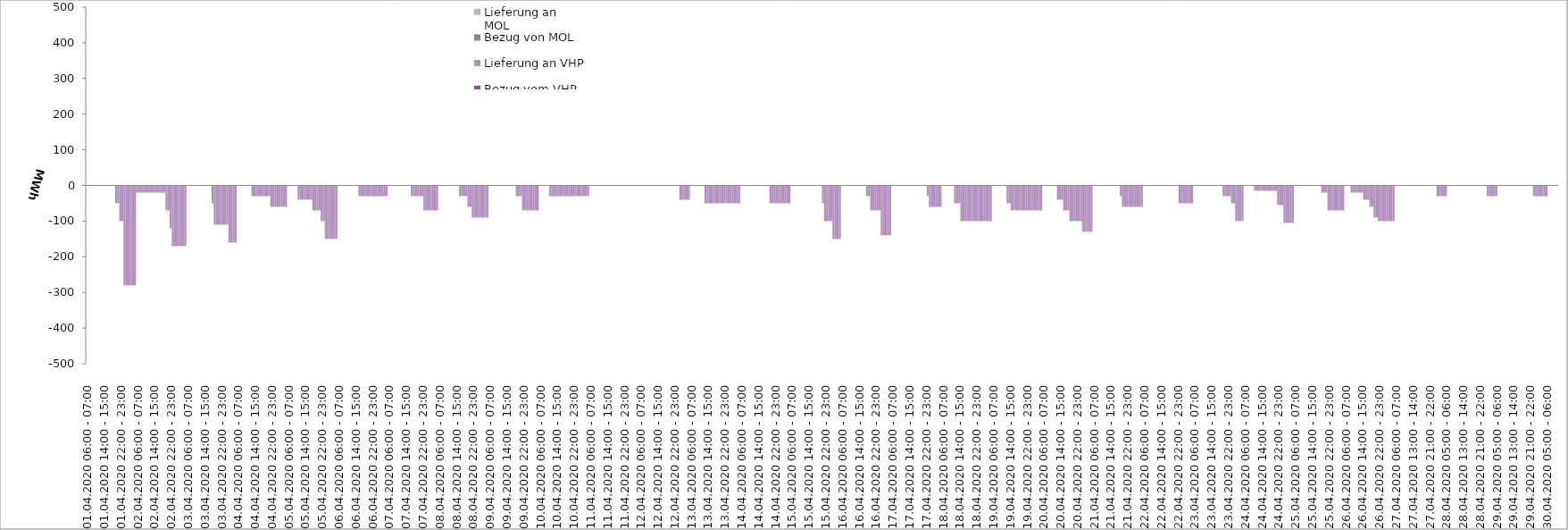
| Category | Bezug vom VHP | Lieferung an VHP | Bezug von MOL | Lieferung an MOL |
|---|---|---|---|---|
| 01.04.2020 06:00 - 07:00 | 0 | 0 | 0 | 0 |
| 01.04.2020 07:00 - 08:00 | 0 | 0 | 0 | 0 |
| 01.04.2020 08:00 - 09:00 | 0 | 0 | 0 | 0 |
| 01.04.2020 09:00 - 10:00 | 0 | 0 | 0 | 0 |
| 01.04.2020 10:00 - 11:00 | 0 | 0 | 0 | 0 |
| 01.04.2020 11:00 - 12:00 | 0 | 0 | 0 | 0 |
| 01.04.2020 12:00 - 13:00 | 0 | 0 | 0 | 0 |
| 01.04.2020 13:00 - 14:00 | 0 | 0 | 0 | 0 |
| 01.04.2020 14:00 - 15:00 | 0 | 0 | 0 | 0 |
| 01.04.2020 15:00 - 16:00 | 0 | 0 | 0 | 0 |
| 01.04.2020 16:00 - 17:00 | 0 | 0 | 0 | 0 |
| 01.04.2020 17:00 - 18:00 | 0 | 0 | 0 | 0 |
| 01.04.2020 18:00 - 19:00 | 0 | 0 | 0 | 0 |
| 01.04.2020 19:00 - 20:00 | 0 | 0 | 0 | 0 |
| 01.04.2020 20:00 - 21:00 | 0 | -50 | 0 | 0 |
| 01.04.2020 21:00 - 22:00 | 0 | -50 | 0 | 0 |
| 01.04.2020 22:00 - 23:00 | 0 | -100 | 0 | 0 |
| 01.04.2020 23:00 - 24:00 | 0 | -100 | 0 | 0 |
| 02.04.2020 00:00 - 01:00 | 0 | -280 | 0 | 0 |
| 02.04.2020 01:00 - 02:00 | 0 | -280 | 0 | 0 |
| 02.04.2020 02:00 - 03:00 | 0 | -280 | 0 | 0 |
| 02.04.2020 03:00 - 04:00 | 0 | -280 | 0 | 0 |
| 02.04.2020 04:00 - 05:00 | 0 | -280 | 0 | 0 |
| 02.04.2020 05:00 - 06:00 | 0 | -280 | 0 | 0 |
| 02.04.2020 06:00 - 07:00 | 0 | -20 | 0 | 0 |
| 02.04.2020 07:00 - 08:00 | 0 | -20 | 0 | 0 |
| 02.04.2020 08:00 - 09:00 | 0 | -20 | 0 | 0 |
| 02.04.2020 09:00 - 10:00 | 0 | -20 | 0 | 0 |
| 02.04.2020 10:00 - 11:00 | 0 | -20 | 0 | 0 |
| 02.04.2020 11:00 - 12:00 | 0 | -20 | 0 | 0 |
| 02.04.2020 12:00 - 13:00 | 0 | -20 | 0 | 0 |
| 02.04.2020 13:00 - 14:00 | 0 | -20 | 0 | 0 |
| 02.04.2020 14:00 - 15:00 | 0 | -20 | 0 | 0 |
| 02.04.2020 15:00 - 16:00 | 0 | -20 | 0 | 0 |
| 02.04.2020 16:00 - 17:00 | 0 | -20 | 0 | 0 |
| 02.04.2020 17:00 - 18:00 | 0 | -20 | 0 | 0 |
| 02.04.2020 18:00 - 19:00 | 0 | -20 | 0 | 0 |
| 02.04.2020 19:00 - 20:00 | 0 | -20 | 0 | 0 |
| 02.04.2020 20:00 - 21:00 | 0 | -70 | 0 | 0 |
| 02.04.2020 21:00 - 22:00 | 0 | -70 | 0 | 0 |
| 02.04.2020 22:00 - 23:00 | 0 | -120 | 0 | 0 |
| 02.04.2020 23:00 - 24:00 | 0 | -170 | 0 | 0 |
| 03.04.2020 00:00 - 01:00 | 0 | -170 | 0 | 0 |
| 03.04.2020 01:00 - 02:00 | 0 | -170 | 0 | 0 |
| 03.04.2020 02:00 - 03:00 | 0 | -170 | 0 | 0 |
| 03.04.2020 03:00 - 04:00 | 0 | -170 | 0 | 0 |
| 03.04.2020 04:00 - 05:00 | 0 | -170 | 0 | 0 |
| 03.04.2020 05:00 - 06:00 | 0 | -170 | 0 | 0 |
| 03.04.2020 06:00 - 07:00 | 0 | 0 | 0 | 0 |
| 03.04.2020 07:00 - 08:00 | 0 | 0 | 0 | 0 |
| 03.04.2020 08:00 - 09:00 | 0 | 0 | 0 | 0 |
| 03.04.2020 09:00 - 10:00 | 0 | 0 | 0 | 0 |
| 03.04.2020 10:00 - 11:00 | 0 | 0 | 0 | 0 |
| 03.04.2020 11:00 - 12:00 | 0 | 0 | 0 | 0 |
| 03.04.2020 12:00 - 13:00 | 0 | 0 | 0 | 0 |
| 03.04.2020 13:00 - 14:00 | 0 | 0 | 0 | 0 |
| 03.04.2020 14:00 - 15:00 | 0 | 0 | 0 | 0 |
| 03.04.2020 15:00 - 16:00 | 0 | 0 | 0 | 0 |
| 03.04.2020 16:00 - 17:00 | 0 | 0 | 0 | 0 |
| 03.04.2020 17:00 - 18:00 | 0 | 0 | 0 | 0 |
| 03.04.2020 18:00 - 19:00 | 0 | -50 | 0 | 0 |
| 03.04.2020 19:00 - 20:00 | 0 | -110 | 0 | 0 |
| 03.04.2020 20:00 - 21:00 | 0 | -110 | 0 | 0 |
| 03.04.2020 21:00 - 22:00 | 0 | -110 | 0 | 0 |
| 03.04.2020 22:00 - 23:00 | 0 | -110 | 0 | 0 |
| 03.04.2020 23:00 - 24:00 | 0 | -110 | 0 | 0 |
| 04.04.2020 00:00 - 01:00 | 0 | -110 | 0 | 0 |
| 04.04.2020 01:00 - 02:00 | 0 | -110 | 0 | 0 |
| 04.04.2020 02:00 - 03:00 | 0 | -160 | 0 | 0 |
| 04.04.2020 03:00 - 04:00 | 0 | -160 | 0 | 0 |
| 04.04.2020 04:00 - 05:00 | 0 | -160 | 0 | 0 |
| 04.04.2020 05:00 - 06:00 | 0 | -160 | 0 | 0 |
| 04.04.2020 06:00 - 07:00 | 0 | 0 | 0 | 0 |
| 04.04.2020 07:00 - 08:00 | 0 | 0 | 0 | 0 |
| 04.04.2020 08:00 - 09:00 | 0 | 0 | 0 | 0 |
| 04.04.2020 09:00 - 10:00 | 0 | 0 | 0 | 0 |
| 04.04.2020 10:00 - 11:00 | 0 | 0 | 0 | 0 |
| 04.04.2020 11:00 - 12:00 | 0 | 0 | 0 | 0 |
| 04.04.2020 12:00 - 13:00 | 0 | 0 | 0 | 0 |
| 04.04.2020 13:00 - 14:00 | 0 | -30 | 0 | 0 |
| 04.04.2020 14:00 - 15:00 | 0 | -30 | 0 | 0 |
| 04.04.2020 15:00 - 16:00 | 0 | -30 | 0 | 0 |
| 04.04.2020 16:00 - 17:00 | 0 | -30 | 0 | 0 |
| 04.04.2020 17:00 - 18:00 | 0 | -30 | 0 | 0 |
| 04.04.2020 18:00 - 19:00 | 0 | -30 | 0 | 0 |
| 04.04.2020 19:00 - 20:00 | 0 | -30 | 0 | 0 |
| 04.04.2020 20:00 - 21:00 | 0 | -30 | 0 | 0 |
| 04.04.2020 21:00 - 22:00 | 0 | -30 | 0 | 0 |
| 04.04.2020 22:00 - 23:00 | 0 | -60 | 0 | 0 |
| 04.04.2020 23:00 - 24:00 | 0 | -60 | 0 | 0 |
| 05.04.2020 00:00 - 01:00 | 0 | -60 | 0 | 0 |
| 05.04.2020 01:00 - 02:00 | 0 | -60 | 0 | 0 |
| 05.04.2020 02:00 - 03:00 | 0 | -60 | 0 | 0 |
| 05.04.2020 03:00 - 04:00 | 0 | -60 | 0 | 0 |
| 05.04.2020 04:00 - 05:00 | 0 | -60 | 0 | 0 |
| 05.04.2020 05:00 - 06:00 | 0 | -60 | 0 | 0 |
| 05.04.2020 06:00 - 07:00 | 0 | 0 | 0 | 0 |
| 05.04.2020 07:00 - 08:00 | 0 | 0 | 0 | 0 |
| 05.04.2020 08:00 - 09:00 | 0 | 0 | 0 | 0 |
| 05.04.2020 09:00 - 10:00 | 0 | 0 | 0 | 0 |
| 05.04.2020 10:00 - 11:00 | 0 | 0 | 0 | 0 |
| 05.04.2020 11:00 - 12:00 | 0 | -40 | 0 | 0 |
| 05.04.2020 12:00 - 13:00 | 0 | -40 | 0 | 0 |
| 05.04.2020 13:00 - 14:00 | 0 | -40 | 0 | 0 |
| 05.04.2020 14:00 - 15:00 | 0 | -40 | 0 | 0 |
| 05.04.2020 15:00 - 16:00 | 0 | -40 | 0 | 0 |
| 05.04.2020 16:00 - 17:00 | 0 | -40 | 0 | 0 |
| 05.04.2020 17:00 - 18:00 | 0 | -40 | 0 | 0 |
| 05.04.2020 18:00 - 19:00 | 0 | -70 | 0 | 0 |
| 05.04.2020 19:00 - 20:00 | 0 | -70 | 0 | 0 |
| 05.04.2020 20:00 - 21:00 | 0 | -70 | 0 | 0 |
| 05.04.2020 21:00 - 22:00 | 0 | -70 | 0 | 0 |
| 05.04.2020 22:00 - 23:00 | 0 | -100 | 0 | 0 |
| 05.04.2020 23:00 - 24:00 | 0 | -100 | 0 | 0 |
| 06.04.2020 00:00 - 01:00 | 0 | -150 | 0 | 0 |
| 06.04.2020 01:00 - 02:00 | 0 | -150 | 0 | 0 |
| 06.04.2020 02:00 - 03:00 | 0 | -150 | 0 | 0 |
| 06.04.2020 03:00 - 04:00 | 0 | -150 | 0 | 0 |
| 06.04.2020 04:00 - 05:00 | 0 | -150 | 0 | 0 |
| 06.04.2020 05:00 - 06:00 | 0 | -150 | 0 | 0 |
| 06.04.2020 06:00 - 07:00 | 0 | 0 | 0 | 0 |
| 06.04.2020 07:00 - 08:00 | 0 | 0 | 0 | 0 |
| 06.04.2020 08:00 - 09:00 | 0 | 0 | 0 | 0 |
| 06.04.2020 09:00 - 10:00 | 0 | 0 | 0 | 0 |
| 06.04.2020 10:00 - 11:00 | 0 | 0 | 0 | 0 |
| 06.04.2020 11:00 - 12:00 | 0 | 0 | 0 | 0 |
| 06.04.2020 12:00 - 13:00 | 0 | 0 | 0 | 0 |
| 06.04.2020 13:00 - 14:00 | 0 | 0 | 0 | 0 |
| 06.04.2020 14:00 - 15:00 | 0 | 0 | 0 | 0 |
| 06.04.2020 15:00 - 16:00 | 0 | 0 | 0 | 0 |
| 06.04.2020 16:00 - 17:00 | 0 | -30 | 0 | 0 |
| 06.04.2020 17:00 - 18:00 | 0 | -30 | 0 | 0 |
| 06.04.2020 18:00 - 19:00 | 0 | -30 | 0 | 0 |
| 06.04.2020 19:00 - 20:00 | 0 | -30 | 0 | 0 |
| 06.04.2020 20:00 - 21:00 | 0 | -30 | 0 | 0 |
| 06.04.2020 21:00 - 22:00 | 0 | -30 | 0 | 0 |
| 06.04.2020 22:00 - 23:00 | 0 | -30 | 0 | 0 |
| 06.04.2020 23:00 - 24:00 | 0 | -30 | 0 | 0 |
| 07.04.2020 00:00 - 01:00 | 0 | -30 | 0 | 0 |
| 07.04.2020 01:00 - 02:00 | 0 | -30 | 0 | 0 |
| 07.04.2020 02:00 - 03:00 | 0 | -30 | 0 | 0 |
| 07.04.2020 03:00 - 04:00 | 0 | -30 | 0 | 0 |
| 07.04.2020 04:00 - 05:00 | 0 | -30 | 0 | 0 |
| 07.04.2020 05:00 - 06:00 | 0 | -30 | 0 | 0 |
| 07.04.2020 06:00 - 07:00 | 0 | 0 | 0 | 0 |
| 07.04.2020 07:00 - 08:00 | 0 | 0 | 0 | 0 |
| 07.04.2020 08:00 - 09:00 | 0 | 0 | 0 | 0 |
| 07.04.2020 09:00 - 10:00 | 0 | 0 | 0 | 0 |
| 07.04.2020 10:00 - 11:00 | 0 | 0 | 0 | 0 |
| 07.04.2020 11:00 - 12:00 | 0 | 0 | 0 | 0 |
| 07.04.2020 12:00 - 13:00 | 0 | 0 | 0 | 0 |
| 07.04.2020 13:00 - 14:00 | 0 | 0 | 0 | 0 |
| 07.04.2020 14:00 - 15:00 | 0 | 0 | 0 | 0 |
| 07.04.2020 15:00 - 16:00 | 0 | 0 | 0 | 0 |
| 07.04.2020 16:00 - 17:00 | 0 | 0 | 0 | 0 |
| 07.04.2020 17:00 - 18:00 | 0 | -30 | 0 | 0 |
| 07.04.2020 18:00 - 19:00 | 0 | -30 | 0 | 0 |
| 07.04.2020 19:00 - 20:00 | 0 | -30 | 0 | 0 |
| 07.04.2020 20:00 - 21:00 | 0 | -30 | 0 | 0 |
| 07.04.2020 21:00 - 22:00 | 0 | -30 | 0 | 0 |
| 07.04.2020 22:00 - 23:00 | 0 | -30 | 0 | 0 |
| 07.04.2020 23:00 - 24:00 | 0 | -70 | 0 | 0 |
| 08.04.2020 00:00 - 01:00 | 0 | -70 | 0 | 0 |
| 08.04.2020 01:00 - 02:00 | 0 | -70 | 0 | 0 |
| 08.04.2020 02:00 - 03:00 | 0 | -70 | 0 | 0 |
| 08.04.2020 03:00 - 04:00 | 0 | -70 | 0 | 0 |
| 08.04.2020 04:00 - 05:00 | 0 | -70 | 0 | 0 |
| 08.04.2020 05:00 - 06:00 | 0 | -70 | 0 | 0 |
| 08.04.2020 06:00 - 07:00 | 0 | 0 | 0 | 0 |
| 08.04.2020 07:00 - 08:00 | 0 | 0 | 0 | 0 |
| 08.04.2020 08:00 - 09:00 | 0 | 0 | 0 | 0 |
| 08.04.2020 09:00 - 10:00 | 0 | 0 | 0 | 0 |
| 08.04.2020 10:00 - 11:00 | 0 | 0 | 0 | 0 |
| 08.04.2020 11:00 - 12:00 | 0 | 0 | 0 | 0 |
| 08.04.2020 12:00 - 13:00 | 0 | 0 | 0 | 0 |
| 08.04.2020 13:00 - 14:00 | 0 | 0 | 0 | 0 |
| 08.04.2020 14:00 - 15:00 | 0 | 0 | 0 | 0 |
| 08.04.2020 15:00 - 16:00 | 0 | 0 | 0 | 0 |
| 08.04.2020 16:00 - 17:00 | 0 | -30 | 0 | 0 |
| 08.04.2020 17:00 - 18:00 | 0 | -30 | 0 | 0 |
| 08.04.2020 18:00 - 19:00 | 0 | -30 | 0 | 0 |
| 08.04.2020 19:00 - 20:00 | 0 | -30 | 0 | 0 |
| 08.04.2020 20:00 - 21:00 | 0 | -60 | 0 | 0 |
| 08.04.2020 21:00 - 22:00 | 0 | -60 | 0 | 0 |
| 08.04.2020 22:00 - 23:00 | 0 | -90 | 0 | 0 |
| 08.04.2020 23:00 - 24:00 | 0 | -90 | 0 | 0 |
| 09.04.2020 00:00 - 01:00 | 0 | -90 | 0 | 0 |
| 09.04.2020 01:00 - 02:00 | 0 | -90 | 0 | 0 |
| 09.04.2020 02:00 - 03:00 | 0 | -90 | 0 | 0 |
| 09.04.2020 03:00 - 04:00 | 0 | -90 | 0 | 0 |
| 09.04.2020 04:00 - 05:00 | 0 | -90 | 0 | 0 |
| 09.04.2020 05:00 - 06:00 | 0 | -90 | 0 | 0 |
| 09.04.2020 06:00 - 07:00 | 0 | 0 | 0 | 0 |
| 09.04.2020 07:00 - 08:00 | 0 | 0 | 0 | 0 |
| 09.04.2020 08:00 - 09:00 | 0 | 0 | 0 | 0 |
| 09.04.2020 09:00 - 10:00 | 0 | 0 | 0 | 0 |
| 09.04.2020 10:00 - 11:00 | 0 | 0 | 0 | 0 |
| 09.04.2020 11:00 - 12:00 | 0 | 0 | 0 | 0 |
| 09.04.2020 12:00 - 13:00 | 0 | 0 | 0 | 0 |
| 09.04.2020 13:00 - 14:00 | 0 | 0 | 0 | 0 |
| 09.04.2020 14:00 - 15:00 | 0 | 0 | 0 | 0 |
| 09.04.2020 15:00 - 16:00 | 0 | 0 | 0 | 0 |
| 09.04.2020 16:00 - 17:00 | 0 | 0 | 0 | 0 |
| 09.04.2020 17:00 - 18:00 | 0 | 0 | 0 | 0 |
| 09.04.2020 18:00 - 19:00 | 0 | 0 | 0 | 0 |
| 09.04.2020 19:00 - 20:00 | 0 | -30 | 0 | 0 |
| 09.04.2020 20:00 - 21:00 | 0 | -30 | 0 | 0 |
| 09.04.2020 21:00 - 22:00 | 0 | -30 | 0 | 0 |
| 09.04.2020 22:00 - 23:00 | 0 | -70 | 0 | 0 |
| 09.04.2020 23:00 - 24:00 | 0 | -70 | 0 | 0 |
| 10.04.2020 00:00 - 01:00 | 0 | -70 | 0 | 0 |
| 10.04.2020 01:00 - 02:00 | 0 | -70 | 0 | 0 |
| 10.04.2020 02:00 - 03:00 | 0 | -70 | 0 | 0 |
| 10.04.2020 03:00 - 04:00 | 0 | -70 | 0 | 0 |
| 10.04.2020 04:00 - 05:00 | 0 | -70 | 0 | 0 |
| 10.04.2020 05:00 - 06:00 | 0 | -70 | 0 | 0 |
| 10.04.2020 06:00 - 07:00 | 0 | 0 | 0 | 0 |
| 10.04.2020 07:00 - 08:00 | 0 | 0 | 0 | 0 |
| 10.04.2020 08:00 - 09:00 | 0 | 0 | 0 | 0 |
| 10.04.2020 09:00 - 10:00 | 0 | 0 | 0 | 0 |
| 10.04.2020 10:00 - 11:00 | 0 | 0 | 0 | 0 |
| 10.04.2020 11:00 - 12:00 | 0 | -30 | 0 | 0 |
| 10.04.2020 12:00 - 13:00 | 0 | -30 | 0 | 0 |
| 10.04.2020 13:00 - 14:00 | 0 | -30 | 0 | 0 |
| 10.04.2020 14:00 - 15:00 | 0 | -30 | 0 | 0 |
| 10.04.2020 15:00 - 16:00 | 0 | -30 | 0 | 0 |
| 10.04.2020 16:00 - 17:00 | 0 | -30 | 0 | 0 |
| 10.04.2020 17:00 - 18:00 | 0 | -30 | 0 | 0 |
| 10.04.2020 18:00 - 19:00 | 0 | -30 | 0 | 0 |
| 10.04.2020 19:00 - 20:00 | 0 | -30 | 0 | 0 |
| 10.04.2020 20:00 - 21:00 | 0 | -30 | 0 | 0 |
| 10.04.2020 21:00 - 22:00 | 0 | -30 | 0 | 0 |
| 10.04.2020 22:00 - 23:00 | 0 | -30 | 0 | 0 |
| 10.04.2020 23:00 - 24:00 | 0 | -30 | 0 | 0 |
| 11.04.2020 00:00 - 01:00 | 0 | -30 | 0 | 0 |
| 11.04.2020 01:00 - 02:00 | 0 | -30 | 0 | 0 |
| 11.04.2020 02:00 - 03:00 | 0 | -30 | 0 | 0 |
| 11.04.2020 03:00 - 04:00 | 0 | -30 | 0 | 0 |
| 11.04.2020 04:00 - 05:00 | 0 | -30 | 0 | 0 |
| 11.04.2020 05:00 - 06:00 | 0 | -30 | 0 | 0 |
| 11.04.2020 06:00 - 07:00 | 0 | 0 | 0 | 0 |
| 11.04.2020 07:00 - 08:00 | 0 | 0 | 0 | 0 |
| 11.04.2020 08:00 - 09:00 | 0 | 0 | 0 | 0 |
| 11.04.2020 09:00 - 10:00 | 0 | 0 | 0 | 0 |
| 11.04.2020 10:00 - 11:00 | 0 | 0 | 0 | 0 |
| 11.04.2020 11:00 - 12:00 | 0 | 0 | 0 | 0 |
| 11.04.2020 12:00 - 13:00 | 0 | 0 | 0 | 0 |
| 11.04.2020 13:00 - 14:00 | 0 | 0 | 0 | 0 |
| 11.04.2020 14:00 - 15:00 | 0 | 0 | 0 | 0 |
| 11.04.2020 15:00 - 16:00 | 0 | 0 | 0 | 0 |
| 11.04.2020 16:00 - 17:00 | 0 | 0 | 0 | 0 |
| 11.04.2020 17:00 - 18:00 | 0 | 0 | 0 | 0 |
| 11.04.2020 18:00 - 19:00 | 0 | 0 | 0 | 0 |
| 11.04.2020 19:00 - 20:00 | 0 | 0 | 0 | 0 |
| 11.04.2020 20:00 - 21:00 | 0 | 0 | 0 | 0 |
| 11.04.2020 21:00 - 22:00 | 0 | 0 | 0 | 0 |
| 11.04.2020 22:00 - 23:00 | 0 | 0 | 0 | 0 |
| 11.04.2020 23:00 - 24:00 | 0 | 0 | 0 | 0 |
| 12.04.2020 00:00 - 01:00 | 0 | 0 | 0 | 0 |
| 12.04.2020 01:00 - 02:00 | 0 | 0 | 0 | 0 |
| 12.04.2020 02:00 - 03:00 | 0 | 0 | 0 | 0 |
| 12.04.2020 03:00 - 04:00 | 0 | 0 | 0 | 0 |
| 12.04.2020 04:00 - 05:00 | 0 | 0 | 0 | 0 |
| 12.04.2020 05:00 - 06:00 | 0 | 0 | 0 | 0 |
| 12.04.2020 06:00 - 07:00 | 0 | 0 | 0 | 0 |
| 12.04.2020 07:00 - 08:00 | 0 | 0 | 0 | 0 |
| 12.04.2020 08:00 - 09:00 | 0 | 0 | 0 | 0 |
| 12.04.2020 09:00 - 10:00 | 0 | 0 | 0 | 0 |
| 12.04.2020 10:00 - 11:00 | 0 | 0 | 0 | 0 |
| 12.04.2020 11:00 - 12:00 | 0 | 0 | 0 | 0 |
| 12.04.2020 12:00 - 13:00 | 0 | 0 | 0 | 0 |
| 12.04.2020 13:00 - 14:00 | 0 | 0 | 0 | 0 |
| 12.04.2020 14:00 - 15:00 | 0 | 0 | 0 | 0 |
| 12.04.2020 15:00 - 16:00 | 0 | 0 | 0 | 0 |
| 12.04.2020 16:00 - 17:00 | 0 | 0 | 0 | 0 |
| 12.04.2020 17:00 - 18:00 | 0 | 0 | 0 | 0 |
| 12.04.2020 18:00 - 19:00 | 0 | 0 | 0 | 0 |
| 12.04.2020 19:00 - 20:00 | 0 | 0 | 0 | 0 |
| 12.04.2020 20:00 - 21:00 | 0 | 0 | 0 | 0 |
| 12.04.2020 21:00 - 22:00 | 0 | 0 | 0 | 0 |
| 12.04.2020 22:00 - 23:00 | 0 | 0 | 0 | 0 |
| 12.04.2020 23:00 - 24:00 | 0 | 0 | 0 | 0 |
| 13.04.2020 00:00 - 01:00 | 0 | 0 | 0 | 0 |
| 13.04.2020 01:00 - 02:00 | 0 | -40 | 0 | 0 |
| 13.04.2020 02:00 - 03:00 | 0 | -40 | 0 | 0 |
| 13.04.2020 03:00 - 04:00 | 0 | -40 | 0 | 0 |
| 13.04.2020 04:00 - 05:00 | 0 | -40 | 0 | 0 |
| 13.04.2020 05:00 - 06:00 | 0 | -40 | 0 | 0 |
| 13.04.2020 06:00 - 07:00 | 0 | 0 | 0 | 0 |
| 13.04.2020 07:00 - 08:00 | 0 | 0 | 0 | 0 |
| 13.04.2020 08:00 - 09:00 | 0 | 0 | 0 | 0 |
| 13.04.2020 09:00 - 10:00 | 0 | 0 | 0 | 0 |
| 13.04.2020 10:00 - 11:00 | 0 | 0 | 0 | 0 |
| 13.04.2020 11:00 - 12:00 | 0 | 0 | 0 | 0 |
| 13.04.2020 12:00 - 13:00 | 0 | 0 | 0 | 0 |
| 13.04.2020 13:00 - 14:00 | 0 | -50 | 0 | 0 |
| 13.04.2020 14:00 - 15:00 | 0 | -50 | 0 | 0 |
| 13.04.2020 15:00 - 16:00 | 0 | -50 | 0 | 0 |
| 13.04.2020 16:00 - 17:00 | 0 | -50 | 0 | 0 |
| 13.04.2020 17:00 - 18:00 | 0 | -50 | 0 | 0 |
| 13.04.2020 18:00 - 19:00 | 0 | -50 | 0 | 0 |
| 13.04.2020 19:00 - 20:00 | 0 | -50 | 0 | 0 |
| 13.04.2020 20:00 - 21:00 | 0 | -50 | 0 | 0 |
| 13.04.2020 21:00 - 22:00 | 0 | -50 | 0 | 0 |
| 13.04.2020 22:00 - 23:00 | 0 | -50 | 0 | 0 |
| 13.04.2020 23:00 - 24:00 | 0 | -50 | 0 | 0 |
| 14.04.2020 00:00 - 01:00 | 0 | -50 | 0 | 0 |
| 14.04.2020 01:00 - 02:00 | 0 | -50 | 0 | 0 |
| 14.04.2020 02:00 - 03:00 | 0 | -50 | 0 | 0 |
| 14.04.2020 03:00 - 04:00 | 0 | -50 | 0 | 0 |
| 14.04.2020 04:00 - 05:00 | 0 | -50 | 0 | 0 |
| 14.04.2020 05:00 - 06:00 | 0 | -50 | 0 | 0 |
| 14.04.2020 06:00 - 07:00 | 0 | 0 | 0 | 0 |
| 14.04.2020 07:00 - 08:00 | 0 | 0 | 0 | 0 |
| 14.04.2020 08:00 - 09:00 | 0 | 0 | 0 | 0 |
| 14.04.2020 09:00 - 10:00 | 0 | 0 | 0 | 0 |
| 14.04.2020 10:00 - 11:00 | 0 | 0 | 0 | 0 |
| 14.04.2020 11:00 - 12:00 | 0 | 0 | 0 | 0 |
| 14.04.2020 12:00 - 13:00 | 0 | 0 | 0 | 0 |
| 14.04.2020 13:00 - 14:00 | 0 | 0 | 0 | 0 |
| 14.04.2020 14:00 - 15:00 | 0 | 0 | 0 | 0 |
| 14.04.2020 15:00 - 16:00 | 0 | 0 | 0 | 0 |
| 14.04.2020 16:00 - 17:00 | 0 | 0 | 0 | 0 |
| 14.04.2020 17:00 - 18:00 | 0 | 0 | 0 | 0 |
| 14.04.2020 18:00 - 19:00 | 0 | 0 | 0 | 0 |
| 14.04.2020 19:00 - 20:00 | 0 | 0 | 0 | 0 |
| 14.04.2020 20:00 - 21:00 | 0 | -50 | 0 | 0 |
| 14.04.2020 21:00 - 22:00 | 0 | -50 | 0 | 0 |
| 14.04.2020 22:00 - 23:00 | 0 | -50 | 0 | 0 |
| 14.04.2020 23:00 - 24:00 | 0 | -50 | 0 | 0 |
| 15.04.2020 00:00 - 01:00 | 0 | -50 | 0 | 0 |
| 15.04.2020 01:00 - 02:00 | 0 | -50 | 0 | 0 |
| 15.04.2020 02:00 - 03:00 | 0 | -50 | 0 | 0 |
| 15.04.2020 03:00 - 04:00 | 0 | -50 | 0 | 0 |
| 15.04.2020 04:00 - 05:00 | 0 | -50 | 0 | 0 |
| 15.04.2020 05:00 - 06:00 | 0 | -50 | 0 | 0 |
| 15.04.2020 06:00 - 07:00 | 0 | 0 | 0 | 0 |
| 15.04.2020 07:00 - 08:00 | 0 | 0 | 0 | 0 |
| 15.04.2020 08:00 - 09:00 | 0 | 0 | 0 | 0 |
| 15.04.2020 09:00 - 10:00 | 0 | 0 | 0 | 0 |
| 15.04.2020 10:00 - 11:00 | 0 | 0 | 0 | 0 |
| 15.04.2020 11:00 - 12:00 | 0 | 0 | 0 | 0 |
| 15.04.2020 12:00 - 13:00 | 0 | 0 | 0 | 0 |
| 15.04.2020 13:00 - 14:00 | 0 | 0 | 0 | 0 |
| 15.04.2020 14:00 - 15:00 | 0 | 0 | 0 | 0 |
| 15.04.2020 15:00 - 16:00 | 0 | 0 | 0 | 0 |
| 15.04.2020 16:00 - 17:00 | 0 | 0 | 0 | 0 |
| 15.04.2020 17:00 - 18:00 | 0 | 0 | 0 | 0 |
| 15.04.2020 18:00 - 19:00 | 0 | 0 | 0 | 0 |
| 15.04.2020 19:00 - 20:00 | 0 | 0 | 0 | 0 |
| 15.04.2020 20:00 - 21:00 | 0 | 0 | 0 | 0 |
| 15.04.2020 21:00 - 22:00 | 0 | -50 | 0 | 0 |
| 15.04.2020 22:00 - 23:00 | 0 | -100 | 0 | 0 |
| 15.04.2020 23:00 - 24:00 | 0 | -100 | 0 | 0 |
| 16.04.2020 00:00 - 01:00 | 0 | -100 | 0 | 0 |
| 16.04.2020 01:00 - 02:00 | 0 | -100 | 0 | 0 |
| 16.04.2020 02:00 - 03:00 | 0 | -150 | 0 | 0 |
| 16.04.2020 03:00 - 04:00 | 0 | -150 | 0 | 0 |
| 16.04.2020 04:00 - 05:00 | 0 | -150 | 0 | 0 |
| 16.04.2020 05:00 - 06:00 | 0 | -150 | 0 | 0 |
| 16.04.2020 06:00 - 07:00 | 0 | 0 | 0 | 0 |
| 16.04.2020 07:00 - 08:00 | 0 | 0 | 0 | 0 |
| 16.04.2020 08:00 - 09:00 | 0 | 0 | 0 | 0 |
| 16.04.2020 09:00 - 10:00 | 0 | 0 | 0 | 0 |
| 16.04.2020 10:00 - 11:00 | 0 | 0 | 0 | 0 |
| 16.04.2020 11:00 - 12:00 | 0 | 0 | 0 | 0 |
| 16.04.2020 12:00 - 13:00 | 0 | 0 | 0 | 0 |
| 16.04.2020 13:00 - 14:00 | 0 | 0 | 0 | 0 |
| 16.04.2020 14:00 - 15:00 | 0 | 0 | 0 | 0 |
| 16.04.2020 15:00 - 16:00 | 0 | 0 | 0 | 0 |
| 16.04.2020 16:00 - 17:00 | 0 | 0 | 0 | 0 |
| 16.04.2020 17:00 - 18:00 | 0 | 0 | 0 | 0 |
| 16.04.2020 18:00 - 19:00 | 0 | -30 | 0 | 0 |
| 16.04.2020 19:00 - 20:00 | 0 | -30 | 0 | 0 |
| 16.04.2020 20:00 - 21:00 | 0 | -70 | 0 | 0 |
| 16.04.2020 21:00 - 22:00 | 0 | -70 | 0 | 0 |
| 16.04.2020 22:00 - 23:00 | 0 | -70 | 0 | 0 |
| 16.04.2020 23:00 - 24:00 | 0 | -70 | 0 | 0 |
| 17.04.2020 00:00 - 01:00 | 0 | -70 | 0 | 0 |
| 17.04.2020 01:00 - 02:00 | 0 | -140 | 0 | 0 |
| 17.04.2020 02:00 - 03:00 | 0 | -140 | 0 | 0 |
| 17.04.2020 03:00 - 04:00 | 0 | -140 | 0 | 0 |
| 17.04.2020 04:00 - 05:00 | 0 | -140 | 0 | 0 |
| 17.04.2020 05:00 - 06:00 | 0 | -140 | 0 | 0 |
| 17.04.2020 06:00 - 07:00 | 0 | 0 | 0 | 0 |
| 17.04.2020 07:00 - 08:00 | 0 | 0 | 0 | 0 |
| 17.04.2020 08:00 - 09:00 | 0 | 0 | 0 | 0 |
| 17.04.2020 09:00 - 10:00 | 0 | 0 | 0 | 0 |
| 17.04.2020 10:00 - 11:00 | 0 | 0 | 0 | 0 |
| 17.04.2020 11:00 - 12:00 | 0 | 0 | 0 | 0 |
| 17.04.2020 12:00 - 13:00 | 0 | 0 | 0 | 0 |
| 17.04.2020 13:00 - 14:00 | 0 | 0 | 0 | 0 |
| 17.04.2020 14:00 - 15:00 | 0 | 0 | 0 | 0 |
| 17.04.2020 15:00 - 16:00 | 0 | 0 | 0 | 0 |
| 17.04.2020 16:00 - 17:00 | 0 | 0 | 0 | 0 |
| 17.04.2020 17:00 - 18:00 | 0 | 0 | 0 | 0 |
| 17.04.2020 18:00 - 19:00 | 0 | 0 | 0 | 0 |
| 17.04.2020 19:00 - 20:00 | 0 | 0 | 0 | 0 |
| 17.04.2020 20:00 - 21:00 | 0 | 0 | 0 | 0 |
| 17.04.2020 21:00 - 22:00 | 0 | 0 | 0 | 0 |
| 17.04.2020 22:00 - 23:00 | 0 | 0 | 0 | 0 |
| 17.04.2020 23:00 - 24:00 | 0 | -30 | 0 | 0 |
| 18.04.2020 00:00 - 01:00 | 0 | -60 | 0 | 0 |
| 18.04.2020 01:00 - 02:00 | 0 | -60 | 0 | 0 |
| 18.04.2020 02:00 - 03:00 | 0 | -60 | 0 | 0 |
| 18.04.2020 03:00 - 04:00 | 0 | -60 | 0 | 0 |
| 18.04.2020 04:00 - 05:00 | 0 | -60 | 0 | 0 |
| 18.04.2020 05:00 - 06:00 | 0 | -60 | 0 | 0 |
| 18.04.2020 06:00 - 07:00 | 0 | 0 | 0 | 0 |
| 18.04.2020 07:00 - 08:00 | 0 | 0 | 0 | 0 |
| 18.04.2020 08:00 - 09:00 | 0 | 0 | 0 | 0 |
| 18.04.2020 09:00 - 10:00 | 0 | 0 | 0 | 0 |
| 18.04.2020 10:00 - 11:00 | 0 | 0 | 0 | 0 |
| 18.04.2020 11:00 - 12:00 | 0 | 0 | 0 | 0 |
| 18.04.2020 12:00 - 13:00 | 0 | -50 | 0 | 0 |
| 18.04.2020 13:00 - 14:00 | 0 | -50 | 0 | 0 |
| 18.04.2020 14:00 - 15:00 | 0 | -50 | 0 | 0 |
| 18.04.2020 15:00 - 16:00 | 0 | -100 | 0 | 0 |
| 18.04.2020 16:00 - 17:00 | 0 | -100 | 0 | 0 |
| 18.04.2020 17:00 - 18:00 | 0 | -100 | 0 | 0 |
| 18.04.2020 18:00 - 19:00 | 0 | -100 | 0 | 0 |
| 18.04.2020 19:00 - 20:00 | 0 | -100 | 0 | 0 |
| 18.04.2020 20:00 - 21:00 | 0 | -100 | 0 | 0 |
| 18.04.2020 21:00 - 22:00 | 0 | -100 | 0 | 0 |
| 18.04.2020 22:00 - 23:00 | 0 | -100 | 0 | 0 |
| 18.04.2020 23:00 - 24:00 | 0 | -100 | 0 | 0 |
| 19.04.2020 00:00 - 01:00 | 0 | -100 | 0 | 0 |
| 19.04.2020 01:00 - 02:00 | 0 | -100 | 0 | 0 |
| 19.04.2020 02:00 - 03:00 | 0 | -100 | 0 | 0 |
| 19.04.2020 03:00 - 04:00 | 0 | -100 | 0 | 0 |
| 19.04.2020 04:00 - 05:00 | 0 | -100 | 0 | 0 |
| 19.04.2020 05:00 - 06:00 | 0 | -100 | 0 | 0 |
| 19.04.2020 06:00 - 07:00 | 0 | 0 | 0 | 0 |
| 19.04.2020 07:00 - 08:00 | 0 | 0 | 0 | 0 |
| 19.04.2020 08:00 - 09:00 | 0 | 0 | 0 | 0 |
| 19.04.2020 09:00 - 10:00 | 0 | 0 | 0 | 0 |
| 19.04.2020 10:00 - 11:00 | 0 | 0 | 0 | 0 |
| 19.04.2020 11:00 - 12:00 | 0 | 0 | 0 | 0 |
| 19.04.2020 12:00 - 13:00 | 0 | 0 | 0 | 0 |
| 19.04.2020 13:00 - 14:00 | 0 | -50 | 0 | 0 |
| 19.04.2020 14:00 - 15:00 | 0 | -50 | 0 | 0 |
| 19.04.2020 15:00 - 16:00 | 0 | -70 | 0 | 0 |
| 19.04.2020 16:00 - 17:00 | 0 | -70 | 0 | 0 |
| 19.04.2020 17:00 - 18:00 | 0 | -70 | 0 | 0 |
| 19.04.2020 18:00 - 19:00 | 0 | -70 | 0 | 0 |
| 19.04.2020 19:00 - 20:00 | 0 | -70 | 0 | 0 |
| 19.04.2020 20:00 - 21:00 | 0 | -70 | 0 | 0 |
| 19.04.2020 21:00 - 22:00 | 0 | -70 | 0 | 0 |
| 19.04.2020 22:00 - 23:00 | 0 | -70 | 0 | 0 |
| 19.04.2020 23:00 - 24:00 | 0 | -70 | 0 | 0 |
| 20.04.2020 00:00 - 01:00 | 0 | -70 | 0 | 0 |
| 20.04.2020 01:00 - 02:00 | 0 | -70 | 0 | 0 |
| 20.04.2020 02:00 - 03:00 | 0 | -70 | 0 | 0 |
| 20.04.2020 03:00 - 04:00 | 0 | -70 | 0 | 0 |
| 20.04.2020 04:00 - 05:00 | 0 | -70 | 0 | 0 |
| 20.04.2020 05:00 - 06:00 | 0 | -70 | 0 | 0 |
| 20.04.2020 06:00 - 07:00 | 0 | 0 | 0 | 0 |
| 20.04.2020 07:00 - 08:00 | 0 | 0 | 0 | 0 |
| 20.04.2020 08:00 - 09:00 | 0 | 0 | 0 | 0 |
| 20.04.2020 09:00 - 10:00 | 0 | 0 | 0 | 0 |
| 20.04.2020 10:00 - 11:00 | 0 | 0 | 0 | 0 |
| 20.04.2020 11:00 - 12:00 | 0 | 0 | 0 | 0 |
| 20.04.2020 12:00 - 13:00 | 0 | 0 | 0 | 0 |
| 20.04.2020 13:00 - 14:00 | 0 | -40 | 0 | 0 |
| 20.04.2020 14:00 - 15:00 | 0 | -40 | 0 | 0 |
| 20.04.2020 15:00 - 16:00 | 0 | -40 | 0 | 0 |
| 20.04.2020 16:00 - 17:00 | 0 | -70 | 0 | 0 |
| 20.04.2020 17:00 - 18:00 | 0 | -70 | 0 | 0 |
| 20.04.2020 18:00 - 19:00 | 0 | -70 | 0 | 0 |
| 20.04.2020 19:00 - 20:00 | 0 | -100 | 0 | 0 |
| 20.04.2020 20:00 - 21:00 | 0 | -100 | 0 | 0 |
| 20.04.2020 21:00 - 22:00 | 0 | -100 | 0 | 0 |
| 20.04.2020 22:00 - 23:00 | 0 | -100 | 0 | 0 |
| 20.04.2020 23:00 - 24:00 | 0 | -100 | 0 | 0 |
| 21.04.2020 00:00 - 01:00 | 0 | -100 | 0 | 0 |
| 21.04.2020 01:00 - 02:00 | 0 | -130 | 0 | 0 |
| 21.04.2020 02:00 - 03:00 | 0 | -130 | 0 | 0 |
| 21.04.2020 03:00 - 04:00 | 0 | -130 | 0 | 0 |
| 21.04.2020 04:00 - 05:00 | 0 | -130 | 0 | 0 |
| 21.04.2020 05:00 - 06:00 | 0 | -130 | 0 | 0 |
| 21.04.2020 06:00 - 07:00 | 0 | 0 | 0 | 0 |
| 21.04.2020 07:00 - 08:00 | 0 | 0 | 0 | 0 |
| 21.04.2020 08:00 - 09:00 | 0 | 0 | 0 | 0 |
| 21.04.2020 09:00 - 10:00 | 0 | 0 | 0 | 0 |
| 21.04.2020 10:00 - 11:00 | 0 | 0 | 0 | 0 |
| 21.04.2020 11:00 - 12:00 | 0 | 0 | 0 | 0 |
| 21.04.2020 12:00 - 13:00 | 0 | 0 | 0 | 0 |
| 21.04.2020 13:00 - 14:00 | 0 | 0 | 0 | 0 |
| 21.04.2020 14:00 - 15:00 | 0 | 0 | 0 | 0 |
| 21.04.2020 15:00 - 16:00 | 0 | 0 | 0 | 0 |
| 21.04.2020 16:00 - 17:00 | 0 | 0 | 0 | 0 |
| 21.04.2020 17:00 - 18:00 | 0 | 0 | 0 | 0 |
| 21.04.2020 18:00 - 19:00 | 0 | 0 | 0 | 0 |
| 21.04.2020 19:00 - 20:00 | 0 | -30 | 0 | 0 |
| 21.04.2020 20:00 - 21:00 | 0 | -60 | 0 | 0 |
| 21.04.2020 21:00 - 22:00 | 0 | -60 | 0 | 0 |
| 21.04.2020 22:00 - 23:00 | 0 | -60 | 0 | 0 |
| 21.04.2020 23:00 - 24:00 | 0 | -60 | 0 | 0 |
| 22.04.2020 00:00 - 01:00 | 0 | -60 | 0 | 0 |
| 22.04.2020 01:00 - 02:00 | 0 | -60 | 0 | 0 |
| 22.04.2020 02:00 - 03:00 | 0 | -60 | 0 | 0 |
| 22.04.2020 03:00 - 04:00 | 0 | -60 | 0 | 0 |
| 22.04.2020 04:00 - 05:00 | 0 | -60 | 0 | 0 |
| 22.04.2020 05:00 - 06:00 | 0 | -60 | 0 | 0 |
| 22.04.2020 06:00 - 07:00 | 0 | 0 | 0 | 0 |
| 22.04.2020 07:00 - 08:00 | 0 | 0 | 0 | 0 |
| 22.04.2020 08:00 - 09:00 | 0 | 0 | 0 | 0 |
| 22.04.2020 09:00 - 10:00 | 0 | 0 | 0 | 0 |
| 22.04.2020 10:00 - 11:00 | 0 | 0 | 0 | 0 |
| 22.04.2020 11:00 - 12:00 | 0 | 0 | 0 | 0 |
| 22.04.2020 12:00 - 13:00 | 0 | 0 | 0 | 0 |
| 22.04.2020 13:00 - 14:00 | 0 | 0 | 0 | 0 |
| 22.04.2020 14:00 - 15:00 | 0 | 0 | 0 | 0 |
| 22.04.2020 15:00 - 16:00 | 0 | 0 | 0 | 0 |
| 22.04.2020 16:00 - 17:00 | 0 | 0 | 0 | 0 |
| 22.04.2020 17:00 - 18:00 | 0 | 0 | 0 | 0 |
| 22.04.2020 18:00 - 19:00 | 0 | 0 | 0 | 0 |
| 22.04.2020 19:00 - 20:00 | 0 | 0 | 0 | 0 |
| 22.04.2020 20:00 - 21:00 | 0 | 0 | 0 | 0 |
| 22.04.2020 21:00 - 22:00 | 0 | 0 | 0 | 0 |
| 22.04.2020 22:00 - 23:00 | 0 | 0 | 0 | 0 |
| 22.04.2020 23:00 - 24:00 | 0 | -50 | 0 | 0 |
| 23.04.2020 00:00 - 01:00 | 0 | -50 | 0 | 0 |
| 23.04.2020 01:00 - 02:00 | 0 | -50 | 0 | 0 |
| 23.04.2020 02:00 - 03:00 | 0 | -50 | 0 | 0 |
| 23.04.2020 03:00 - 04:00 | 0 | -50 | 0 | 0 |
| 23.04.2020 04:00 - 05:00 | 0 | -50 | 0 | 0 |
| 23.04.2020 05:00 - 06:00 | 0 | -50 | 0 | 0 |
| 23.04.2020 06:00 - 07:00 | 0 | 0 | 0 | 0 |
| 23.04.2020 07:00 - 08:00 | 0 | 0 | 0 | 0 |
| 23.04.2020 08:00 - 09:00 | 0 | 0 | 0 | 0 |
| 23.04.2020 09:00 - 10:00 | 0 | 0 | 0 | 0 |
| 23.04.2020 10:00 - 11:00 | 0 | 0 | 0 | 0 |
| 23.04.2020 11:00 - 12:00 | 0 | 0 | 0 | 0 |
| 23.04.2020 12:00 - 13:00 | 0 | 0 | 0 | 0 |
| 23.04.2020 13:00 - 14:00 | 0 | 0 | 0 | 0 |
| 23.04.2020 14:00 - 15:00 | 0 | 0 | 0 | 0 |
| 23.04.2020 15:00 - 16:00 | 0 | 0 | 0 | 0 |
| 23.04.2020 16:00 - 17:00 | 0 | 0 | 0 | 0 |
| 23.04.2020 17:00 - 18:00 | 0 | 0 | 0 | 0 |
| 23.04.2020 18:00 - 19:00 | 0 | 0 | 0 | 0 |
| 23.04.2020 19:00 - 20:00 | 0 | 0 | 0 | 0 |
| 23.04.2020 20:00 - 21:00 | 0 | -30 | 0 | 0 |
| 23.04.2020 21:00 - 22:00 | 0 | -30 | 0 | 0 |
| 23.04.2020 22:00 - 23:00 | 0 | -30 | 0 | 0 |
| 23.04.2020 23:00 - 24:00 | 0 | -30 | 0 | 0 |
| 24.04.2020 00:00 - 01:00 | 0 | -50 | 0 | 0 |
| 24.04.2020 01:00 - 02:00 | 0 | -50 | 0 | 0 |
| 24.04.2020 02:00 - 03:00 | 0 | -100 | 0 | 0 |
| 24.04.2020 03:00 - 04:00 | 0 | -100 | 0 | 0 |
| 24.04.2020 04:00 - 05:00 | 0 | -100 | 0 | 0 |
| 24.04.2020 05:00 - 06:00 | 0 | -100 | 0 | 0 |
| 24.04.2020 06:00 - 07:00 | 0 | 0 | 0 | 0 |
| 24.04.2020 07:00 - 08:00 | 0 | 0 | 0 | 0 |
| 24.04.2020 08:00 - 09:00 | 0 | 0 | 0 | 0 |
| 24.04.2020 09:00 - 10:00 | 0 | 0 | 0 | 0 |
| 24.04.2020 10:00 - 11:00 | 0 | 0 | 0 | 0 |
| 24.04.2020 11:00 - 12:00 | 0 | -15 | 0 | 0 |
| 24.04.2020 12:00 - 13:00 | 0 | -15 | 0 | 0 |
| 24.04.2020 13:00 - 14:00 | 0 | -15 | 0 | 0 |
| 24.04.2020 14:00 - 15:00 | 0 | -15 | 0 | 0 |
| 24.04.2020 15:00 - 16:00 | 0 | -15 | 0 | 0 |
| 24.04.2020 16:00 - 17:00 | 0 | -15 | 0 | 0 |
| 24.04.2020 17:00 - 18:00 | 0 | -15 | 0 | 0 |
| 24.04.2020 18:00 - 19:00 | 0 | -15 | 0 | 0 |
| 24.04.2020 19:00 - 20:00 | 0 | -15 | 0 | 0 |
| 24.04.2020 20:00 - 21:00 | 0 | -15 | 0 | 0 |
| 24.04.2020 21:00 - 22:00 | 0 | -15 | 0 | 0 |
| 24.04.2020 22:00 - 23:00 | 0 | -55 | 0 | 0 |
| 24.04.2020 23:00 - 24:00 | 0 | -55 | 0 | 0 |
| 25.04.2020 00:00 - 01:00 | 0 | -55 | 0 | 0 |
| 25.04.2020 01:00 - 02:00 | 0 | -105 | 0 | 0 |
| 25.04.2020 02:00 - 03:00 | 0 | -105 | 0 | 0 |
| 25.04.2020 03:00 - 04:00 | 0 | -105 | 0 | 0 |
| 25.04.2020 04:00 - 05:00 | 0 | -105 | 0 | 0 |
| 25.04.2020 05:00 - 06:00 | 0 | -105 | 0 | 0 |
| 25.04.2020 06:00 - 07:00 | 0 | 0 | 0 | 0 |
| 25.04.2020 07:00 - 08:00 | 0 | 0 | 0 | 0 |
| 25.04.2020 08:00 - 09:00 | 0 | 0 | 0 | 0 |
| 25.04.2020 09:00 - 10:00 | 0 | 0 | 0 | 0 |
| 25.04.2020 10:00 - 11:00 | 0 | 0 | 0 | 0 |
| 25.04.2020 11:00 - 12:00 | 0 | 0 | 0 | 0 |
| 25.04.2020 12:00 - 13:00 | 0 | 0 | 0 | 0 |
| 25.04.2020 13:00 - 14:00 | 0 | 0 | 0 | 0 |
| 25.04.2020 14:00 - 15:00 | 0 | 0 | 0 | 0 |
| 25.04.2020 15:00 - 16:00 | 0 | 0 | 0 | 0 |
| 25.04.2020 16:00 - 17:00 | 0 | 0 | 0 | 0 |
| 25.04.2020 17:00 - 18:00 | 0 | 0 | 0 | 0 |
| 25.04.2020 18:00 - 19:00 | 0 | 0 | 0 | 0 |
| 25.04.2020 19:00 - 20:00 | 0 | -20 | 0 | 0 |
| 25.04.2020 20:00 - 21:00 | 0 | -20 | 0 | 0 |
| 25.04.2020 21:00 - 22:00 | 0 | -20 | 0 | 0 |
| 25.04.2020 22:00 - 23:00 | 0 | -70 | 0 | 0 |
| 25.04.2020 23:00 - 24:00 | 0 | -70 | 0 | 0 |
| 26.04.2020 00:00 - 01:00 | 0 | -70 | 0 | 0 |
| 26.04.2020 01:00 - 02:00 | 0 | -70 | 0 | 0 |
| 26.04.2020 02:00 - 03:00 | 0 | -70 | 0 | 0 |
| 26.04.2020 03:00 - 04:00 | 0 | -70 | 0 | 0 |
| 26.04.2020 04:00 - 05:00 | 0 | -70 | 0 | 0 |
| 26.04.2020 05:00 - 06:00 | 0 | -70 | 0 | 0 |
| 26.04.2020 06:00 - 07:00 | 0 | 0 | 0 | 0 |
| 26.04.2020 07:00 - 08:00 | 0 | 0 | 0 | 0 |
| 26.04.2020 08:00 - 09:00 | 0 | 0 | 0 | 0 |
| 26.04.2020 09:00 - 10:00 | 0 | -20 | 0 | 0 |
| 26.04.2020 10:00 - 11:00 | 0 | -20 | 0 | 0 |
| 26.04.2020 11:00 - 12:00 | 0 | -20 | 0 | 0 |
| 26.04.2020 12:00 - 13:00 | 0 | -20 | 0 | 0 |
| 26.04.2020 13:00 - 14:00 | 0 | -20 | 0 | 0 |
| 26.04.2020 14:00 - 15:00 | 0 | -20 | 0 | 0 |
| 26.04.2020 15:00 - 16:00 | 0 | -40 | 0 | 0 |
| 26.04.2020 16:00 - 17:00 | 0 | -40 | 0 | 0 |
| 26.04.2020 17:00 - 18:00 | 0 | -40 | 0 | 0 |
| 26.04.2020 18:00 - 19:00 | 0 | -60 | 0 | 0 |
| 26.04.2020 19:00 - 20:00 | 0 | -60 | 0 | 0 |
| 26.04.2020 20:00 - 21:00 | 0 | -90 | 0 | 0 |
| 26.04.2020 21:00 - 22:00 | 0 | -90 | 0 | 0 |
| 26.04.2020 22:00 - 23:00 | 0 | -100 | 0 | 0 |
| 26.04.2020 23:00 - 24:00 | 0 | -100 | 0 | 0 |
| 27.04.2020 00:00 - 01:00 | 0 | -100 | 0 | 0 |
| 27.04.2020 01:00 - 02:00 | 0 | -100 | 0 | 0 |
| 27.04.2020 02:00 - 03:00 | 0 | -100 | 0 | 0 |
| 27.04.2020 03:00 - 04:00 | 0 | -100 | 0 | 0 |
| 27.04.2020 04:00 - 05:00 | 0 | -100 | 0 | 0 |
| 27.04.2020 05:00 - 06:00 | 0 | -100 | 0 | 0 |
| 27.04.2020 06:00 - 07:00 | 0 | 0 | 0 | 0 |
| 27.04.2020 07:00 - 08:00 | 0 | 0 | 0 | 0 |
| 27.04.2020 08:00 - 09:00 | 0 | 0 | 0 | 0 |
| 27.04.2020 09:00 - 10:00 | 0 | 0 | 0 | 0 |
| 27.04.2020 10:00 - 11:00 | 0 | 0 | 0 | 0 |
| 27.04.2020 11:00 - 12:00 | 0 | 0 | 0 | 0 |
| 27.04.2020 12:00 - 13:00 | 0 | 0 | 0 | 0 |
| 27.04.2020 12:00 - 13:00 | 0 | 0 | 0 | 0 |
| 27.04.2020 13:00 - 14:00 | 0 | 0 | 0 | 0 |
| 27.04.2020 14:00 - 15:00 | 0 | 0 | 0 | 0 |
| 27.04.2020 15:00 - 16:00 | 0 | 0 | 0 | 0 |
| 27.04.2020 16:00 - 17:00 | 0 | 0 | 0 | 0 |
| 27.04.2020 17:00 - 18:00 | 0 | 0 | 0 | 0 |
| 27.04.2020 18:00 - 19:00 | 0 | 0 | 0 | 0 |
| 27.04.2020 19:00 - 20:00 | 0 | 0 | 0 | 0 |
| 27.04.2020 20:00 - 21:00 | 0 | 0 | 0 | 0 |
| 27.04.2020 21:00 - 22:00 | 0 | 0 | 0 | 0 |
| 27.04.2020 22:00 - 23:00 | 0 | 0 | 0 | 0 |
| 27.04.2020 23:00 - 24:00 | 0 | 0 | 0 | 0 |
| 28.04.2020 00:00 - 01:00 | 0 | 0 | 0 | 0 |
| 28.04.2020 01:00 - 02:00 | 0 | -30 | 0 | 0 |
| 28.04.2020 02:00 - 03:00 | 0 | -30 | 0 | 0 |
| 28.04.2020 03:00 - 04:00 | 0 | -30 | 0 | 0 |
| 28.04.2020 04:00 - 05:00 | 0 | -30 | 0 | 0 |
| 28.04.2020 05:00 - 06:00 | 0 | -30 | 0 | 0 |
| 28.04.2020 06:00 - 07:00 | 0 | 0 | 0 | 0 |
| 28.04.2020 07:00 - 08:00 | 0 | 0 | 0 | 0 |
| 28.04.2020 08:00 - 09:00 | 0 | 0 | 0 | 0 |
| 28.04.2020 09:00 - 10:00 | 0 | 0 | 0 | 0 |
| 28.04.2020 10:00 - 11:00 | 0 | 0 | 0 | 0 |
| 28.04.2020 11:00 - 12:00 | 0 | 0 | 0 | 0 |
| 28.04.2020 12:00 - 13:00 | 0 | 0 | 0 | 0 |
| 28.04.2020 13:00 - 14:00 | 0 | 0 | 0 | 0 |
| 28.04.2020 14:00 - 15:00 | 0 | 0 | 0 | 0 |
| 28.04.2020 15:00 - 16:00 | 0 | 0 | 0 | 0 |
| 28.04.2020 16:00 - 17:00 | 0 | 0 | 0 | 0 |
| 28.04.2020 17:00 - 18:00 | 0 | 0 | 0 | 0 |
| 28.04.2020 18:00 - 19:00 | 0 | 0 | 0 | 0 |
| 28.04.2020 19:00 - 20:00 | 0 | 0 | 0 | 0 |
| 28.04.2020 20:00 - 21:00 | 0 | 0 | 0 | 0 |
| 28.04.2020 21:00 - 22:00 | 0 | 0 | 0 | 0 |
| 28.04.2020 22:00 - 23:00 | 0 | 0 | 0 | 0 |
| 28.04.2020 23:00 - 24:00 | 0 | 0 | 0 | 0 |
| 29.04.2020 00:00 - 01:00 | 0 | 0 | 0 | 0 |
| 29.04.2020 01:00 - 02:00 | 0 | -30 | 0 | 0 |
| 29.04.2020 02:00 - 03:00 | 0 | -30 | 0 | 0 |
| 29.04.2020 03:00 - 04:00 | 0 | -30 | 0 | 0 |
| 29.04.2020 04:00 - 05:00 | 0 | -30 | 0 | 0 |
| 29.04.2020 05:00 - 06:00 | 0 | -30 | 0 | 0 |
| 29.04.2020 06:00 - 07:00 | 0 | 0 | 0 | 0 |
| 29.04.2020 07:00 - 08:00 | 0 | 0 | 0 | 0 |
| 29.04.2020 08:00 - 09:00 | 0 | 0 | 0 | 0 |
| 29.04.2020 09:00 - 10:00 | 0 | 0 | 0 | 0 |
| 29.04.2020 10:00 - 11:00 | 0 | 0 | 0 | 0 |
| 29.04.2020 11:00 - 12:00 | 0 | 0 | 0 | 0 |
| 29.04.2020 12:00 - 13:00 | 0 | 0 | 0 | 0 |
| 29.04.2020 13:00 - 14:00 | 0 | 0 | 0 | 0 |
| 29.04.2020 14:00 - 15:00 | 0 | 0 | 0 | 0 |
| 29.04.2020 15:00 - 16:00 | 0 | 0 | 0 | 0 |
| 29.04.2020 16:00 - 17:00 | 0 | 0 | 0 | 0 |
| 29.04.2020 17:00 - 18:00 | 0 | 0 | 0 | 0 |
| 29.04.2020 18:00 - 19:00 | 0 | 0 | 0 | 0 |
| 29.04.2020 19:00 - 20:00 | 0 | 0 | 0 | 0 |
| 29.04.2020 20:00 - 21:00 | 0 | 0 | 0 | 0 |
| 29.04.2020 21:00 - 22:00 | 0 | 0 | 0 | 0 |
| 29.04.2020 22:00 - 23:00 | 0 | 0 | 0 | 0 |
| 29.04.2020 23:00 - 24:00 | 0 | -30 | 0 | 0 |
| 30.04.2020 00:00 - 01:00 | 0 | -30 | 0 | 0 |
| 30.04.2020 01:00 - 02:00 | 0 | -30 | 0 | 0 |
| 30.04.2020 02:00 - 03:00 | 0 | -30 | 0 | 0 |
| 30.04.2020 03:00 - 04:00 | 0 | -30 | 0 | 0 |
| 30.04.2020 04:00 - 05:00 | 0 | -30 | 0 | 0 |
| 30.04.2020 05:00 - 06:00 | 0 | -30 | 0 | 0 |
| 30.04.2020 06:00 - 07:00 | 0 | 0 | 0 | 0 |
| 30.04.2020 07:00 - 08:00 | 0 | 0 | 0 | 0 |
| 30.04.2020 08:00 - 09:00 | 0 | 0 | 0 | 0 |
| 30.04.2020 09:00 - 10:00 | 0 | 0 | 0 | 0 |
| 30.04.2020 10:00 - 11:00 | 0 | 0 | 0 | 0 |